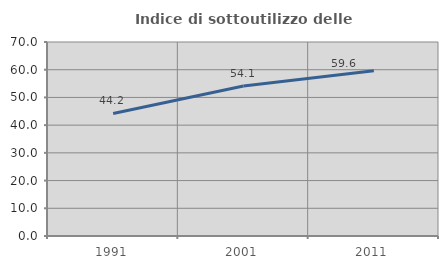
| Category | Indice di sottoutilizzo delle abitazioni  |
|---|---|
| 1991.0 | 44.219 |
| 2001.0 | 54.092 |
| 2011.0 | 59.6 |